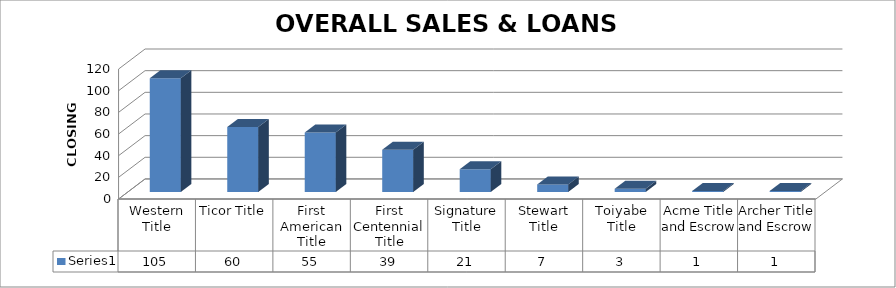
| Category | Series 0 |
|---|---|
| Western Title | 105 |
| Ticor Title | 60 |
| First American Title | 55 |
| First Centennial Title | 39 |
| Signature Title | 21 |
| Stewart Title | 7 |
| Toiyabe Title | 3 |
| Acme Title and Escrow | 1 |
| Archer Title and Escrow | 1 |